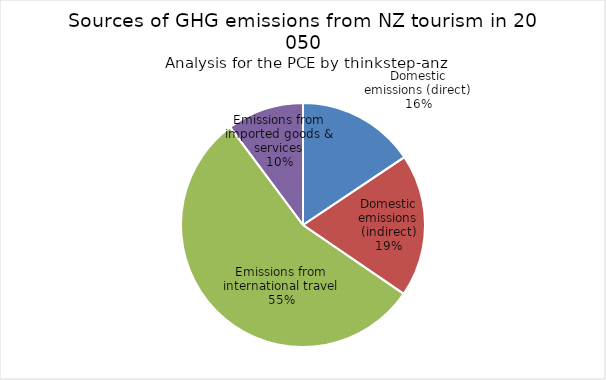
| Category | Series 0 |
|---|---|
| Domestic emissions (direct) | 1815.375 |
| Domestic emissions (indirect) | 2201.717 |
| Emissions from international travel | 6424.609 |
| Emissions from imported goods & services | 1186.387 |